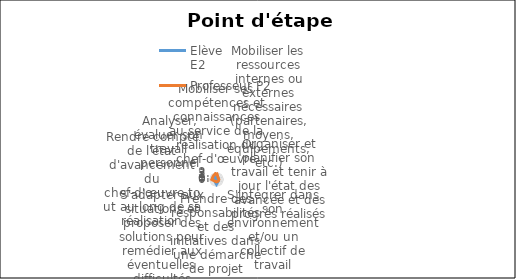
| Category | Elève 
E2 | Professeur P2 |
|---|---|---|
| Mobiliser ses compétences et connaissances au service de la réalisation du chef-d'œuvre | 2 | 3 |
| Mobiliser les ressources internes ou externes nécessaires (partenaires, moyens, équipements, etc.) | 1 | 1 |
| Organiser et planifier son travail et tenir à jour l'état des avancée et des progrès réalisés | 0 | 1 |
| S'intégrer dans son environnement et/ou un collectif de travail | 1 | 1 |
| Prendre des responsabilités et des initiatives dans une démarche de projet | 2 | 1 |
| S'adapter aux situations et proposer des solutions pour remédier aux éventuelles difficultés rencontrées | 1 | 1 |
| Rendre compte de l'état d'avancement du chef-d'œuvre tout au long de sa réalisation | 1 | 2 |
| Analyser, évaluer son travail personnel | 1 | 2 |